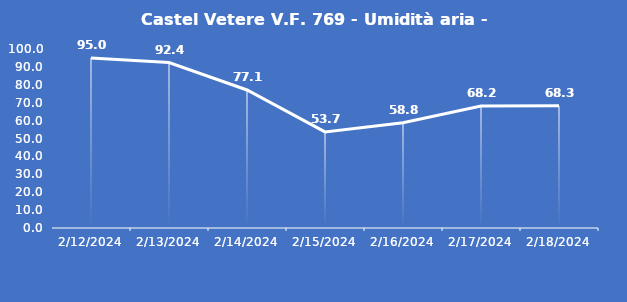
| Category | Castel Vetere V.F. 769 - Umidità aria - Grezzo (%) |
|---|---|
| 2/12/24 | 95 |
| 2/13/24 | 92.4 |
| 2/14/24 | 77.1 |
| 2/15/24 | 53.7 |
| 2/16/24 | 58.8 |
| 2/17/24 | 68.2 |
| 2/18/24 | 68.3 |